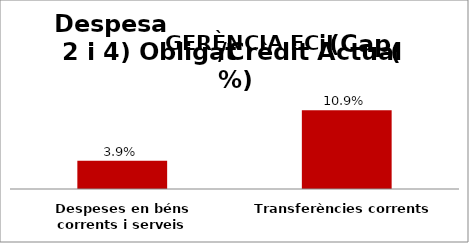
| Category | Series 0 |
|---|---|
| Despeses en béns corrents i serveis | 0.039 |
| Transferències corrents | 0.109 |